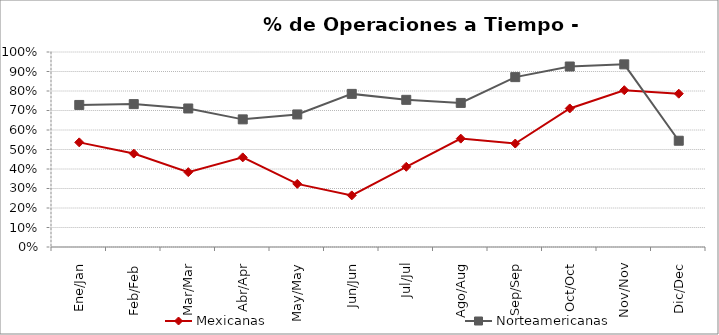
| Category | Mexicanas | Norteamericanas |
|---|---|---|
| Ene/Jan | 0.537 | 0.729 |
| Feb/Feb | 0.479 | 0.733 |
| Mar/Mar | 0.384 | 0.71 |
| Abr/Apr | 0.46 | 0.655 |
| May/May | 0.324 | 0.68 |
| Jun/Jun | 0.265 | 0.785 |
| Jul/Jul | 0.411 | 0.755 |
| Ago/Aug | 0.556 | 0.739 |
| Sep/Sep | 0.531 | 0.871 |
| Oct/Oct | 0.711 | 0.926 |
| Nov/Nov | 0.804 | 0.937 |
| Dic/Dec | 0.786 | 0.545 |